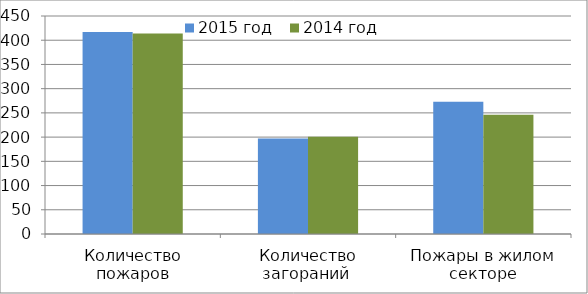
| Category | 2015 год | 2014 год |
|---|---|---|
| Количество пожаров | 417 | 414 |
| Количество загораний  | 197 | 201 |
| Пожары в жилом секторе | 273 | 246 |